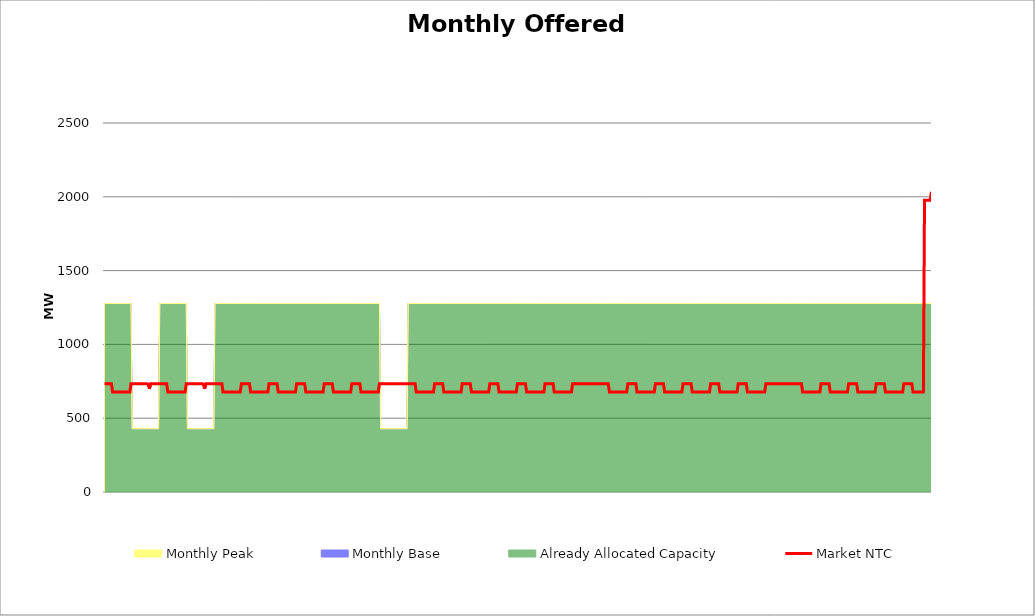
| Category | Market NTC |
|---|---|
| 0 | 734 |
| 1 | 734 |
| 2 | 734 |
| 3 | 734 |
| 4 | 734 |
| 5 | 734 |
| 6 | 734 |
| 7 | 677 |
| 8 | 677 |
| 9 | 677 |
| 10 | 677 |
| 11 | 677 |
| 12 | 677 |
| 13 | 677 |
| 14 | 677 |
| 15 | 677 |
| 16 | 677 |
| 17 | 677 |
| 18 | 677 |
| 19 | 677 |
| 20 | 677 |
| 21 | 677 |
| 22 | 677 |
| 23 | 734 |
| 24 | 734 |
| 25 | 734 |
| 26 | 734 |
| 27 | 734 |
| 28 | 734 |
| 29 | 734 |
| 30 | 734 |
| 31 | 734 |
| 32 | 734 |
| 33 | 734 |
| 34 | 734 |
| 35 | 734 |
| 36 | 734 |
| 37 | 734 |
| 38 | 727 |
| 39 | 699 |
| 40 | 734 |
| 41 | 734 |
| 42 | 734 |
| 43 | 734 |
| 44 | 734 |
| 45 | 734 |
| 46 | 734 |
| 47 | 734 |
| 48 | 734 |
| 49 | 734 |
| 50 | 734 |
| 51 | 734 |
| 52 | 734 |
| 53 | 734 |
| 54 | 734 |
| 55 | 677 |
| 56 | 677 |
| 57 | 677 |
| 58 | 677 |
| 59 | 677 |
| 60 | 677 |
| 61 | 677 |
| 62 | 677 |
| 63 | 677 |
| 64 | 677 |
| 65 | 677 |
| 66 | 677 |
| 67 | 677 |
| 68 | 677 |
| 69 | 677 |
| 70 | 677 |
| 71 | 734 |
| 72 | 734 |
| 73 | 734 |
| 74 | 734 |
| 75 | 734 |
| 76 | 734 |
| 77 | 734 |
| 78 | 734 |
| 79 | 734 |
| 80 | 734 |
| 81 | 734 |
| 82 | 734 |
| 83 | 734 |
| 84 | 734 |
| 85 | 734 |
| 86 | 727 |
| 87 | 699 |
| 88 | 734 |
| 89 | 734 |
| 90 | 734 |
| 91 | 734 |
| 92 | 734 |
| 93 | 734 |
| 94 | 734 |
| 95 | 734 |
| 96 | 734 |
| 97 | 734 |
| 98 | 734 |
| 99 | 734 |
| 100 | 734 |
| 101 | 734 |
| 102 | 734 |
| 103 | 677 |
| 104 | 677 |
| 105 | 677 |
| 106 | 677 |
| 107 | 677 |
| 108 | 677 |
| 109 | 677 |
| 110 | 677 |
| 111 | 677 |
| 112 | 677 |
| 113 | 677 |
| 114 | 677 |
| 115 | 677 |
| 116 | 677 |
| 117 | 677 |
| 118 | 677 |
| 119 | 734 |
| 120 | 734 |
| 121 | 734 |
| 122 | 734 |
| 123 | 734 |
| 124 | 734 |
| 125 | 734 |
| 126 | 734 |
| 127 | 677 |
| 128 | 677 |
| 129 | 677 |
| 130 | 677 |
| 131 | 677 |
| 132 | 677 |
| 133 | 677 |
| 134 | 677 |
| 135 | 677 |
| 136 | 677 |
| 137 | 677 |
| 138 | 677 |
| 139 | 677 |
| 140 | 677 |
| 141 | 677 |
| 142 | 677 |
| 143 | 734 |
| 144 | 734 |
| 145 | 734 |
| 146 | 734 |
| 147 | 734 |
| 148 | 734 |
| 149 | 734 |
| 150 | 734 |
| 151 | 677 |
| 152 | 677 |
| 153 | 677 |
| 154 | 677 |
| 155 | 677 |
| 156 | 677 |
| 157 | 677 |
| 158 | 677 |
| 159 | 677 |
| 160 | 677 |
| 161 | 677 |
| 162 | 677 |
| 163 | 677 |
| 164 | 677 |
| 165 | 677 |
| 166 | 677 |
| 167 | 734 |
| 168 | 734 |
| 169 | 734 |
| 170 | 734 |
| 171 | 734 |
| 172 | 734 |
| 173 | 734 |
| 174 | 734 |
| 175 | 677 |
| 176 | 677 |
| 177 | 677 |
| 178 | 677 |
| 179 | 677 |
| 180 | 677 |
| 181 | 677 |
| 182 | 677 |
| 183 | 677 |
| 184 | 677 |
| 185 | 677 |
| 186 | 677 |
| 187 | 677 |
| 188 | 677 |
| 189 | 677 |
| 190 | 677 |
| 191 | 734 |
| 192 | 734 |
| 193 | 734 |
| 194 | 734 |
| 195 | 734 |
| 196 | 734 |
| 197 | 734 |
| 198 | 734 |
| 199 | 677 |
| 200 | 677 |
| 201 | 677 |
| 202 | 677 |
| 203 | 677 |
| 204 | 677 |
| 205 | 677 |
| 206 | 677 |
| 207 | 677 |
| 208 | 677 |
| 209 | 677 |
| 210 | 677 |
| 211 | 677 |
| 212 | 677 |
| 213 | 677 |
| 214 | 677 |
| 215 | 734 |
| 216 | 734 |
| 217 | 734 |
| 218 | 734 |
| 219 | 734 |
| 220 | 734 |
| 221 | 734 |
| 222 | 734 |
| 223 | 677 |
| 224 | 677 |
| 225 | 677 |
| 226 | 677 |
| 227 | 677 |
| 228 | 677 |
| 229 | 677 |
| 230 | 677 |
| 231 | 677 |
| 232 | 677 |
| 233 | 677 |
| 234 | 677 |
| 235 | 677 |
| 236 | 677 |
| 237 | 677 |
| 238 | 677 |
| 239 | 734 |
| 240 | 734 |
| 241 | 734 |
| 242 | 734 |
| 243 | 734 |
| 244 | 734 |
| 245 | 734 |
| 246 | 734 |
| 247 | 734 |
| 248 | 734 |
| 249 | 734 |
| 250 | 734 |
| 251 | 734 |
| 252 | 734 |
| 253 | 734 |
| 254 | 734 |
| 255 | 734 |
| 256 | 734 |
| 257 | 734 |
| 258 | 734 |
| 259 | 734 |
| 260 | 734 |
| 261 | 734 |
| 262 | 734 |
| 263 | 734 |
| 264 | 734 |
| 265 | 734 |
| 266 | 734 |
| 267 | 734 |
| 268 | 734 |
| 269 | 734 |
| 270 | 734 |
| 271 | 677 |
| 272 | 677 |
| 273 | 677 |
| 274 | 677 |
| 275 | 677 |
| 276 | 677 |
| 277 | 677 |
| 278 | 677 |
| 279 | 677 |
| 280 | 677 |
| 281 | 677 |
| 282 | 677 |
| 283 | 677 |
| 284 | 677 |
| 285 | 677 |
| 286 | 677 |
| 287 | 734 |
| 288 | 734 |
| 289 | 734 |
| 290 | 734 |
| 291 | 734 |
| 292 | 734 |
| 293 | 734 |
| 294 | 734 |
| 295 | 677 |
| 296 | 677 |
| 297 | 677 |
| 298 | 677 |
| 299 | 677 |
| 300 | 677 |
| 301 | 677 |
| 302 | 677 |
| 303 | 677 |
| 304 | 677 |
| 305 | 677 |
| 306 | 677 |
| 307 | 677 |
| 308 | 677 |
| 309 | 677 |
| 310 | 677 |
| 311 | 734 |
| 312 | 734 |
| 313 | 734 |
| 314 | 734 |
| 315 | 734 |
| 316 | 734 |
| 317 | 734 |
| 318 | 734 |
| 319 | 677 |
| 320 | 677 |
| 321 | 677 |
| 322 | 677 |
| 323 | 677 |
| 324 | 677 |
| 325 | 677 |
| 326 | 677 |
| 327 | 677 |
| 328 | 677 |
| 329 | 677 |
| 330 | 677 |
| 331 | 677 |
| 332 | 677 |
| 333 | 677 |
| 334 | 677 |
| 335 | 734 |
| 336 | 734 |
| 337 | 734 |
| 338 | 734 |
| 339 | 734 |
| 340 | 734 |
| 341 | 734 |
| 342 | 734 |
| 343 | 677 |
| 344 | 677 |
| 345 | 677 |
| 346 | 677 |
| 347 | 677 |
| 348 | 677 |
| 349 | 677 |
| 350 | 677 |
| 351 | 677 |
| 352 | 677 |
| 353 | 677 |
| 354 | 677 |
| 355 | 677 |
| 356 | 677 |
| 357 | 677 |
| 358 | 677 |
| 359 | 734 |
| 360 | 734 |
| 361 | 734 |
| 362 | 734 |
| 363 | 734 |
| 364 | 734 |
| 365 | 734 |
| 366 | 734 |
| 367 | 677 |
| 368 | 677 |
| 369 | 677 |
| 370 | 677 |
| 371 | 677 |
| 372 | 677 |
| 373 | 677 |
| 374 | 677 |
| 375 | 677 |
| 376 | 677 |
| 377 | 677 |
| 378 | 677 |
| 379 | 677 |
| 380 | 677 |
| 381 | 677 |
| 382 | 677 |
| 383 | 734 |
| 384 | 734 |
| 385 | 734 |
| 386 | 734 |
| 387 | 734 |
| 388 | 734 |
| 389 | 734 |
| 390 | 734 |
| 391 | 677 |
| 392 | 677 |
| 393 | 677 |
| 394 | 677 |
| 395 | 677 |
| 396 | 677 |
| 397 | 677 |
| 398 | 677 |
| 399 | 677 |
| 400 | 677 |
| 401 | 677 |
| 402 | 677 |
| 403 | 677 |
| 404 | 677 |
| 405 | 677 |
| 406 | 677 |
| 407 | 734 |
| 408 | 734 |
| 409 | 734 |
| 410 | 734 |
| 411 | 734 |
| 412 | 734 |
| 413 | 734 |
| 414 | 734 |
| 415 | 734 |
| 416 | 734 |
| 417 | 734 |
| 418 | 734 |
| 419 | 734 |
| 420 | 734 |
| 421 | 734 |
| 422 | 734 |
| 423 | 734 |
| 424 | 734 |
| 425 | 734 |
| 426 | 734 |
| 427 | 734 |
| 428 | 734 |
| 429 | 734 |
| 430 | 734 |
| 431 | 734 |
| 432 | 734 |
| 433 | 734 |
| 434 | 734 |
| 435 | 734 |
| 436 | 734 |
| 437 | 734 |
| 438 | 734 |
| 439 | 677 |
| 440 | 677 |
| 441 | 677 |
| 442 | 677 |
| 443 | 677 |
| 444 | 677 |
| 445 | 677 |
| 446 | 677 |
| 447 | 677 |
| 448 | 677 |
| 449 | 677 |
| 450 | 677 |
| 451 | 677 |
| 452 | 677 |
| 453 | 677 |
| 454 | 677 |
| 455 | 734 |
| 456 | 734 |
| 457 | 734 |
| 458 | 734 |
| 459 | 734 |
| 460 | 734 |
| 461 | 734 |
| 462 | 734 |
| 463 | 677 |
| 464 | 677 |
| 465 | 677 |
| 466 | 677 |
| 467 | 677 |
| 468 | 677 |
| 469 | 677 |
| 470 | 677 |
| 471 | 677 |
| 472 | 677 |
| 473 | 677 |
| 474 | 677 |
| 475 | 677 |
| 476 | 677 |
| 477 | 677 |
| 478 | 677 |
| 479 | 734 |
| 480 | 734 |
| 481 | 734 |
| 482 | 734 |
| 483 | 734 |
| 484 | 734 |
| 485 | 734 |
| 486 | 734 |
| 487 | 677 |
| 488 | 677 |
| 489 | 677 |
| 490 | 677 |
| 491 | 677 |
| 492 | 677 |
| 493 | 677 |
| 494 | 677 |
| 495 | 677 |
| 496 | 677 |
| 497 | 677 |
| 498 | 677 |
| 499 | 677 |
| 500 | 677 |
| 501 | 677 |
| 502 | 677 |
| 503 | 734 |
| 504 | 734 |
| 505 | 734 |
| 506 | 734 |
| 507 | 734 |
| 508 | 734 |
| 509 | 734 |
| 510 | 734 |
| 511 | 677 |
| 512 | 677 |
| 513 | 677 |
| 514 | 677 |
| 515 | 677 |
| 516 | 677 |
| 517 | 677 |
| 518 | 677 |
| 519 | 677 |
| 520 | 677 |
| 521 | 677 |
| 522 | 677 |
| 523 | 677 |
| 524 | 677 |
| 525 | 677 |
| 526 | 677 |
| 527 | 734 |
| 528 | 734 |
| 529 | 734 |
| 530 | 734 |
| 531 | 734 |
| 532 | 734 |
| 533 | 734 |
| 534 | 734 |
| 535 | 677 |
| 536 | 677 |
| 537 | 677 |
| 538 | 677 |
| 539 | 677 |
| 540 | 677 |
| 541 | 677 |
| 542 | 677 |
| 543 | 677 |
| 544 | 677 |
| 545 | 677 |
| 546 | 677 |
| 547 | 677 |
| 548 | 677 |
| 549 | 677 |
| 550 | 677 |
| 551 | 734 |
| 552 | 734 |
| 553 | 734 |
| 554 | 734 |
| 555 | 734 |
| 556 | 734 |
| 557 | 734 |
| 558 | 734 |
| 559 | 677 |
| 560 | 677 |
| 561 | 677 |
| 562 | 677 |
| 563 | 677 |
| 564 | 677 |
| 565 | 677 |
| 566 | 677 |
| 567 | 677 |
| 568 | 677 |
| 569 | 677 |
| 570 | 677 |
| 571 | 677 |
| 572 | 677 |
| 573 | 677 |
| 574 | 677 |
| 575 | 734 |
| 576 | 734 |
| 577 | 734 |
| 578 | 734 |
| 579 | 734 |
| 580 | 734 |
| 581 | 734 |
| 582 | 734 |
| 583 | 734 |
| 584 | 734 |
| 585 | 734 |
| 586 | 734 |
| 587 | 734 |
| 588 | 734 |
| 589 | 734 |
| 590 | 734 |
| 591 | 734 |
| 592 | 734 |
| 593 | 734 |
| 594 | 734 |
| 595 | 734 |
| 596 | 734 |
| 597 | 734 |
| 598 | 734 |
| 599 | 734 |
| 600 | 734 |
| 601 | 734 |
| 602 | 734 |
| 603 | 734 |
| 604 | 734 |
| 605 | 734 |
| 606 | 734 |
| 607 | 677 |
| 608 | 677 |
| 609 | 677 |
| 610 | 677 |
| 611 | 677 |
| 612 | 677 |
| 613 | 677 |
| 614 | 677 |
| 615 | 677 |
| 616 | 677 |
| 617 | 677 |
| 618 | 677 |
| 619 | 677 |
| 620 | 677 |
| 621 | 677 |
| 622 | 677 |
| 623 | 734 |
| 624 | 734 |
| 625 | 734 |
| 626 | 734 |
| 627 | 734 |
| 628 | 734 |
| 629 | 734 |
| 630 | 734 |
| 631 | 677 |
| 632 | 677 |
| 633 | 677 |
| 634 | 677 |
| 635 | 677 |
| 636 | 677 |
| 637 | 677 |
| 638 | 677 |
| 639 | 677 |
| 640 | 677 |
| 641 | 677 |
| 642 | 677 |
| 643 | 677 |
| 644 | 677 |
| 645 | 677 |
| 646 | 677 |
| 647 | 734 |
| 648 | 734 |
| 649 | 734 |
| 650 | 734 |
| 651 | 734 |
| 652 | 734 |
| 653 | 734 |
| 654 | 734 |
| 655 | 677 |
| 656 | 677 |
| 657 | 677 |
| 658 | 677 |
| 659 | 677 |
| 660 | 677 |
| 661 | 677 |
| 662 | 677 |
| 663 | 677 |
| 664 | 677 |
| 665 | 677 |
| 666 | 677 |
| 667 | 677 |
| 668 | 677 |
| 669 | 677 |
| 670 | 677 |
| 671 | 734 |
| 672 | 734 |
| 673 | 734 |
| 674 | 734 |
| 675 | 734 |
| 676 | 734 |
| 677 | 734 |
| 678 | 734 |
| 679 | 677 |
| 680 | 677 |
| 681 | 677 |
| 682 | 677 |
| 683 | 677 |
| 684 | 677 |
| 685 | 677 |
| 686 | 677 |
| 687 | 677 |
| 688 | 677 |
| 689 | 677 |
| 690 | 677 |
| 691 | 677 |
| 692 | 677 |
| 693 | 677 |
| 694 | 677 |
| 695 | 734 |
| 696 | 734 |
| 697 | 734 |
| 698 | 734 |
| 699 | 734 |
| 700 | 734 |
| 701 | 734 |
| 702 | 734 |
| 703 | 677 |
| 704 | 677 |
| 705 | 677 |
| 706 | 677 |
| 707 | 677 |
| 708 | 677 |
| 709 | 677 |
| 710 | 677 |
| 711 | 677 |
| 712 | 677 |
| 713 | 1977 |
| 714 | 1977 |
| 715 | 1977 |
| 716 | 1977 |
| 717 | 1977 |
| 718 | 1977 |
| 719 | 2034 |